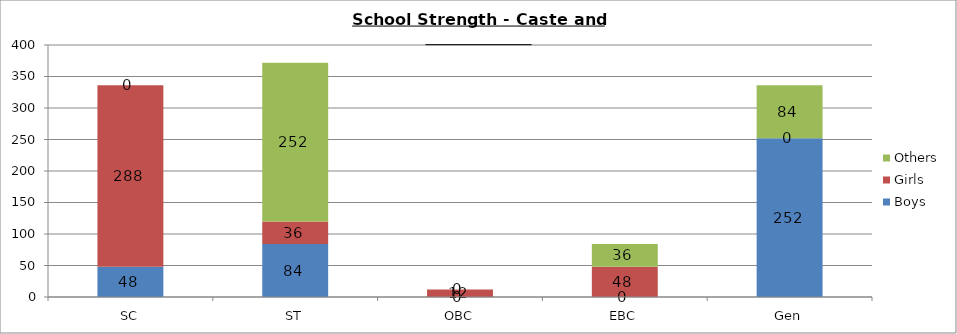
| Category | Boys | Girls | Others |
|---|---|---|---|
| SC | 48 | 288 | 0 |
| ST | 84 | 36 | 252 |
| OBC | 0 | 12 | 0 |
| EBC | 0 | 48 | 36 |
| Gen | 252 | 0 | 84 |